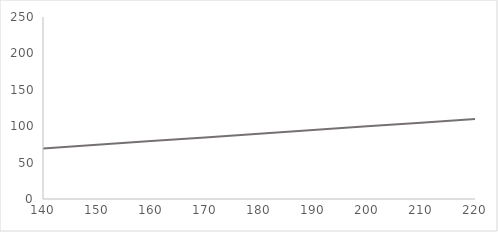
| Category | Series 0 |
|---|---|
| 140.0 | 69.417 |
| 150.0 | 74.486 |
| 160.0 | 79.555 |
| 170.0 | 84.625 |
| 180.0 | 89.694 |
| 190.0 | 94.763 |
| 200.0 | 99.833 |
| 210.0 | 104.902 |
| 220.0 | 109.972 |